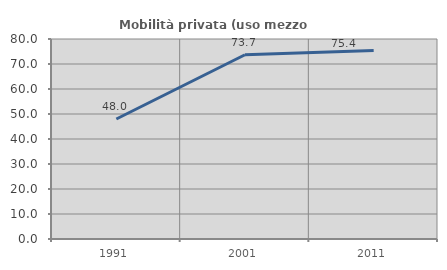
| Category | Mobilità privata (uso mezzo privato) |
|---|---|
| 1991.0 | 48 |
| 2001.0 | 73.711 |
| 2011.0 | 75.449 |